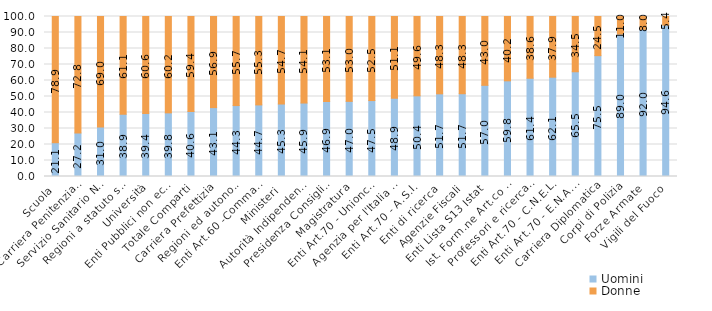
| Category | Uomini | Donne |
|---|---|---|
| Scuola | 21.106 | 78.894 |
| Carriera Penitenziaria | 27.197 | 72.803 |
| Servizio Sanitario Naz. | 30.986 | 69.014 |
| Regioni a statuto speciale e Prov. Aut. | 38.903 | 61.097 |
| Università | 39.373 | 60.627 |
| Enti Pubblici non economici | 39.771 | 60.229 |
| Totale Comparti | 40.609 | 59.391 |
| Carriera Prefettizia | 43.06 | 56.94 |
| Regioni ed autonomie locali | 44.334 | 55.666 |
| Enti Art.60 -Comma 3- D.165/01 | 44.733 | 55.267 |
| Ministeri | 45.305 | 54.695 |
| Autorità Indipendenti | 45.91 | 54.09 |
| Presidenza Consiglio Ministri | 46.866 | 53.134 |
| Magistratura | 46.969 | 53.031 |
| Enti Art.70 - Unioncamere | 47.458 | 52.542 |
| Agenzia per l'Italia digitale | 48.913 | 51.087 |
| Enti Art.70 - A.S.I. | 50.416 | 49.584 |
| Enti di ricerca | 51.673 | 48.327 |
| Agenzie Fiscali | 51.745 | 48.255 |
| Enti Lista S13 Istat | 56.98 | 43.02 |
| Ist. Form.ne Art.co Mus.le | 59.793 | 40.207 |
| Professori e ricercatori universitari | 61.418 | 38.582 |
| Enti Art.70 - C.N.E.L. | 62.069 | 37.931 |
| Enti Art.70 - E.N.A.C. | 65.461 | 34.539 |
| Carriera Diplomatica | 75.526 | 24.474 |
| Corpi di Polizia | 89.008 | 10.992 |
| Forze Armate | 91.979 | 8.021 |
| Vigili del Fuoco | 94.593 | 5.407 |